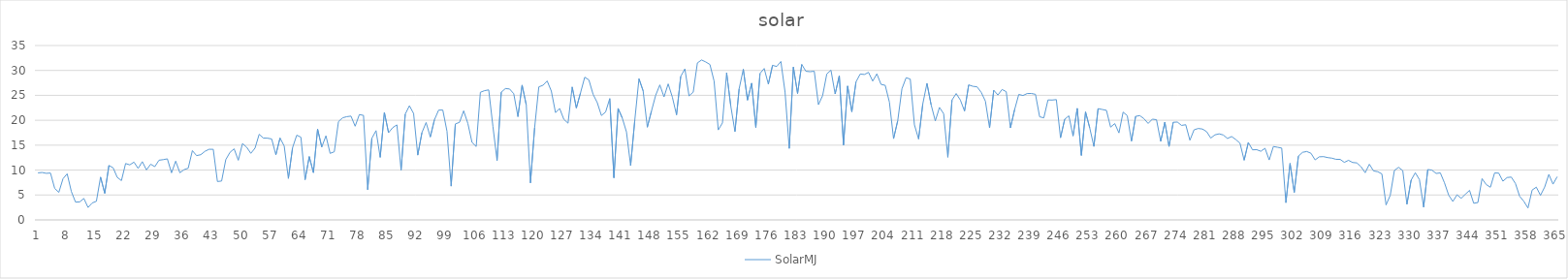
| Category | SolarMJ |
|---|---|
| 0 | 9.437 |
| 1 | 9.515 |
| 2 | 9.351 |
| 3 | 9.409 |
| 4 | 6.347 |
| 5 | 5.535 |
| 6 | 8.264 |
| 7 | 9.253 |
| 8 | 5.698 |
| 9 | 3.57 |
| 10 | 3.619 |
| 11 | 4.301 |
| 12 | 2.498 |
| 13 | 3.408 |
| 14 | 3.735 |
| 15 | 8.595 |
| 16 | 5.343 |
| 17 | 10.925 |
| 18 | 10.466 |
| 19 | 8.537 |
| 20 | 7.893 |
| 21 | 11.321 |
| 22 | 11.043 |
| 23 | 11.605 |
| 24 | 10.337 |
| 25 | 11.69 |
| 26 | 10.034 |
| 27 | 11.176 |
| 28 | 10.691 |
| 29 | 11.983 |
| 30 | 12.094 |
| 31 | 12.254 |
| 32 | 9.448 |
| 33 | 11.801 |
| 34 | 9.465 |
| 35 | 10.078 |
| 36 | 10.378 |
| 37 | 13.903 |
| 38 | 12.904 |
| 39 | 13.083 |
| 40 | 13.763 |
| 41 | 14.176 |
| 42 | 14.169 |
| 43 | 7.703 |
| 44 | 7.804 |
| 45 | 12.091 |
| 46 | 13.558 |
| 47 | 14.269 |
| 48 | 11.97 |
| 49 | 15.317 |
| 50 | 14.599 |
| 51 | 13.364 |
| 52 | 14.393 |
| 53 | 17.182 |
| 54 | 16.427 |
| 55 | 16.406 |
| 56 | 16.244 |
| 57 | 13.068 |
| 58 | 16.442 |
| 59 | 14.82 |
| 60 | 8.318 |
| 61 | 14.485 |
| 62 | 17.003 |
| 63 | 16.604 |
| 64 | 8.069 |
| 65 | 12.707 |
| 66 | 9.489 |
| 67 | 18.232 |
| 68 | 14.627 |
| 69 | 16.875 |
| 70 | 13.353 |
| 71 | 13.676 |
| 72 | 19.739 |
| 73 | 20.495 |
| 74 | 20.722 |
| 75 | 20.832 |
| 76 | 18.805 |
| 77 | 21.141 |
| 78 | 20.976 |
| 79 | 6.06 |
| 80 | 16.376 |
| 81 | 17.921 |
| 82 | 12.556 |
| 83 | 21.561 |
| 84 | 17.501 |
| 85 | 18.531 |
| 86 | 19.068 |
| 87 | 9.99 |
| 88 | 21.229 |
| 89 | 22.908 |
| 90 | 21.364 |
| 91 | 13.005 |
| 92 | 17.523 |
| 93 | 19.546 |
| 94 | 16.649 |
| 95 | 20.118 |
| 96 | 22.039 |
| 97 | 22.051 |
| 98 | 17.791 |
| 99 | 6.779 |
| 100 | 19.257 |
| 101 | 19.59 |
| 102 | 21.896 |
| 103 | 19.374 |
| 104 | 15.551 |
| 105 | 14.729 |
| 106 | 25.616 |
| 107 | 25.941 |
| 108 | 26.096 |
| 109 | 18.802 |
| 110 | 11.91 |
| 111 | 25.626 |
| 112 | 26.363 |
| 113 | 26.28 |
| 114 | 25.323 |
| 115 | 20.725 |
| 116 | 27.05 |
| 117 | 23.063 |
| 118 | 7.424 |
| 119 | 18.489 |
| 120 | 26.704 |
| 121 | 27.021 |
| 122 | 27.891 |
| 123 | 25.861 |
| 124 | 21.54 |
| 125 | 22.354 |
| 126 | 20.182 |
| 127 | 19.421 |
| 128 | 26.68 |
| 129 | 22.466 |
| 130 | 25.523 |
| 131 | 28.641 |
| 132 | 28.106 |
| 133 | 25.223 |
| 134 | 23.548 |
| 135 | 20.955 |
| 136 | 21.641 |
| 137 | 24.353 |
| 138 | 8.454 |
| 139 | 22.375 |
| 140 | 20.449 |
| 141 | 17.666 |
| 142 | 10.898 |
| 143 | 20.028 |
| 144 | 28.337 |
| 145 | 25.89 |
| 146 | 18.61 |
| 147 | 21.871 |
| 148 | 25.012 |
| 149 | 27.095 |
| 150 | 24.687 |
| 151 | 27.3 |
| 152 | 24.638 |
| 153 | 21.084 |
| 154 | 28.796 |
| 155 | 30.312 |
| 156 | 24.888 |
| 157 | 25.652 |
| 158 | 31.51 |
| 159 | 32.1 |
| 160 | 31.704 |
| 161 | 31.191 |
| 162 | 27.856 |
| 163 | 18.059 |
| 164 | 19.464 |
| 165 | 29.519 |
| 166 | 22.845 |
| 167 | 17.729 |
| 168 | 26.323 |
| 169 | 30.241 |
| 170 | 24.044 |
| 171 | 27.441 |
| 172 | 18.544 |
| 173 | 29.394 |
| 174 | 30.397 |
| 175 | 27.261 |
| 176 | 31.02 |
| 177 | 30.794 |
| 178 | 31.8 |
| 179 | 25.657 |
| 180 | 14.348 |
| 181 | 30.666 |
| 182 | 25.376 |
| 183 | 31.203 |
| 184 | 29.83 |
| 185 | 29.748 |
| 186 | 29.838 |
| 187 | 23.132 |
| 188 | 24.939 |
| 189 | 29.289 |
| 190 | 30.056 |
| 191 | 25.276 |
| 192 | 28.954 |
| 193 | 15.024 |
| 194 | 26.875 |
| 195 | 21.71 |
| 196 | 27.711 |
| 197 | 29.277 |
| 198 | 29.19 |
| 199 | 29.609 |
| 200 | 27.863 |
| 201 | 29.315 |
| 202 | 27.199 |
| 203 | 27.012 |
| 204 | 23.645 |
| 205 | 16.313 |
| 206 | 19.927 |
| 207 | 26.303 |
| 208 | 28.537 |
| 209 | 28.27 |
| 210 | 19.079 |
| 211 | 16.234 |
| 212 | 23.275 |
| 213 | 27.407 |
| 214 | 23.103 |
| 215 | 19.872 |
| 216 | 22.574 |
| 217 | 21.31 |
| 218 | 12.576 |
| 219 | 24.06 |
| 220 | 25.364 |
| 221 | 24.061 |
| 222 | 21.852 |
| 223 | 27.102 |
| 224 | 26.815 |
| 225 | 26.713 |
| 226 | 25.606 |
| 227 | 23.836 |
| 228 | 18.472 |
| 229 | 26.027 |
| 230 | 25.062 |
| 231 | 26.182 |
| 232 | 25.723 |
| 233 | 18.472 |
| 234 | 22.128 |
| 235 | 25.184 |
| 236 | 24.964 |
| 237 | 25.362 |
| 238 | 25.376 |
| 239 | 25.205 |
| 240 | 20.695 |
| 241 | 20.488 |
| 242 | 24.08 |
| 243 | 24.057 |
| 244 | 24.145 |
| 245 | 16.493 |
| 246 | 20.195 |
| 247 | 20.896 |
| 248 | 16.849 |
| 249 | 22.384 |
| 250 | 12.945 |
| 251 | 21.673 |
| 252 | 18.472 |
| 253 | 14.746 |
| 254 | 22.332 |
| 255 | 22.164 |
| 256 | 21.993 |
| 257 | 18.627 |
| 258 | 19.329 |
| 259 | 17.461 |
| 260 | 21.632 |
| 261 | 20.911 |
| 262 | 15.813 |
| 263 | 20.789 |
| 264 | 20.932 |
| 265 | 20.316 |
| 266 | 19.362 |
| 267 | 20.225 |
| 268 | 20.115 |
| 269 | 15.761 |
| 270 | 19.626 |
| 271 | 14.749 |
| 272 | 19.594 |
| 273 | 19.642 |
| 274 | 18.965 |
| 275 | 19.108 |
| 276 | 15.995 |
| 277 | 18.084 |
| 278 | 18.35 |
| 279 | 18.244 |
| 280 | 17.722 |
| 281 | 16.43 |
| 282 | 17.074 |
| 283 | 17.275 |
| 284 | 17.043 |
| 285 | 16.341 |
| 286 | 16.733 |
| 287 | 16.125 |
| 288 | 15.393 |
| 289 | 11.981 |
| 290 | 15.551 |
| 291 | 14.067 |
| 292 | 14.099 |
| 293 | 13.781 |
| 294 | 14.376 |
| 295 | 12.035 |
| 296 | 14.737 |
| 297 | 14.575 |
| 298 | 14.414 |
| 299 | 3.458 |
| 300 | 11.343 |
| 301 | 5.522 |
| 302 | 12.798 |
| 303 | 13.567 |
| 304 | 13.732 |
| 305 | 13.382 |
| 306 | 12.047 |
| 307 | 12.661 |
| 308 | 12.702 |
| 309 | 12.511 |
| 310 | 12.393 |
| 311 | 12.159 |
| 312 | 12.149 |
| 313 | 11.554 |
| 314 | 11.961 |
| 315 | 11.524 |
| 316 | 11.441 |
| 317 | 10.683 |
| 318 | 9.473 |
| 319 | 11.171 |
| 320 | 9.834 |
| 321 | 9.676 |
| 322 | 9.234 |
| 323 | 3.003 |
| 324 | 4.934 |
| 325 | 9.933 |
| 326 | 10.555 |
| 327 | 9.895 |
| 328 | 3.136 |
| 329 | 7.971 |
| 330 | 9.47 |
| 331 | 8.084 |
| 332 | 2.561 |
| 333 | 10.116 |
| 334 | 9.988 |
| 335 | 9.321 |
| 336 | 9.437 |
| 337 | 7.44 |
| 338 | 4.974 |
| 339 | 3.7 |
| 340 | 5.036 |
| 341 | 4.341 |
| 342 | 5.15 |
| 343 | 5.933 |
| 344 | 3.34 |
| 345 | 3.489 |
| 346 | 8.28 |
| 347 | 7.092 |
| 348 | 6.557 |
| 349 | 9.422 |
| 350 | 9.389 |
| 351 | 7.769 |
| 352 | 8.504 |
| 353 | 8.596 |
| 354 | 7.304 |
| 355 | 4.75 |
| 356 | 3.741 |
| 357 | 2.389 |
| 358 | 5.994 |
| 359 | 6.573 |
| 360 | 4.933 |
| 361 | 6.587 |
| 362 | 9.125 |
| 363 | 7.181 |
| 364 | 8.675 |